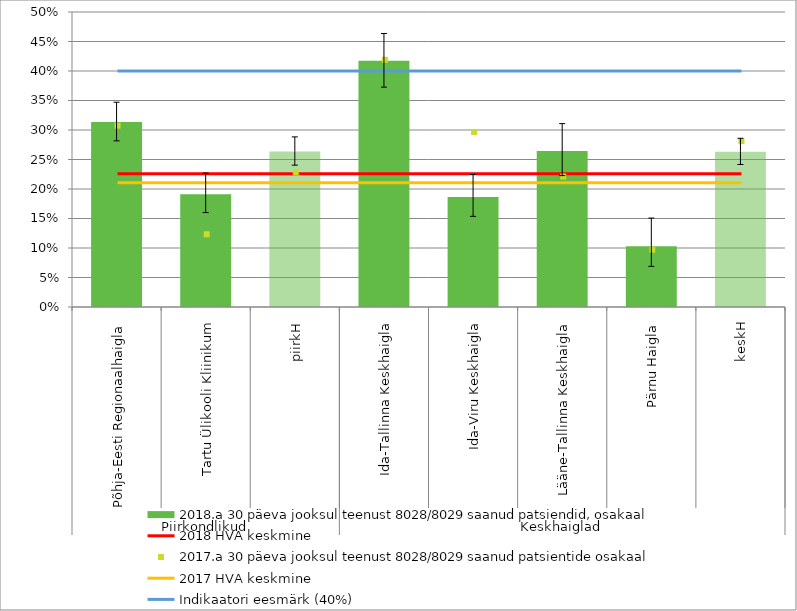
| Category | 2018.a 30 päeva jooksul teenust 8028/8029 saanud patsiendid, osakaal |
|---|---|
| 0 | 0.313 |
| 1 | 0.191 |
| 2 | 0.264 |
| 3 | 0.417 |
| 4 | 0.187 |
| 5 | 0.264 |
| 6 | 0.103 |
| 7 | 0.263 |